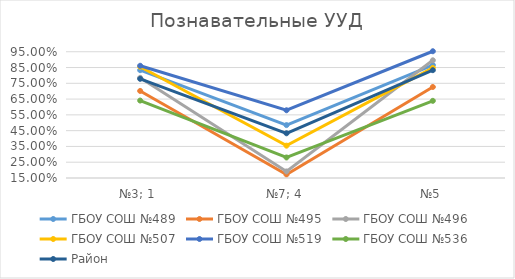
| Category | ГБОУ СОШ №489 | ГБОУ СОШ №495 | ГБОУ СОШ №496 | ГБОУ СОШ №507 | ГБОУ СОШ №519 | ГБОУ СОШ №536 | Район |
|---|---|---|---|---|---|---|---|
| №3; 1 | 0.833 | 0.702 | 0.785 | 0.855 | 0.861 | 0.641 | 0.778 |
| №7; 4 | 0.485 | 0.172 | 0.192 | 0.355 | 0.579 | 0.28 | 0.433 |
| №5 | 0.866 | 0.727 | 0.896 | 0.848 | 0.953 | 0.639 | 0.833 |